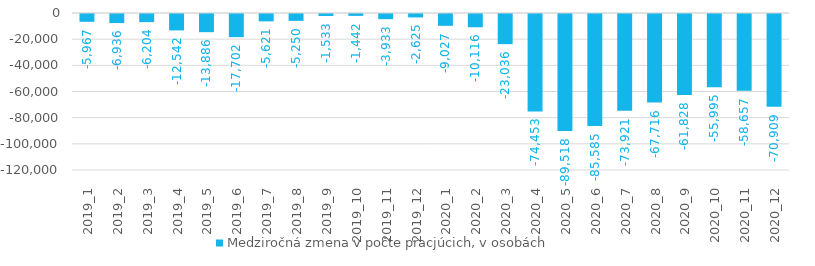
| Category | Medziročná zmena v počte pracjúcich, v osobách |
|---|---|
| 2019_1 | -5967 |
| 2019_2 | -6936 |
| 2019_3 | -6204 |
| 2019_4 | -12542 |
| 2019_5 | -13886 |
| 2019_6 | -17702 |
| 2019_7 | -5621 |
| 2019_8 | -5250 |
| 2019_9 | -1533 |
| 2019_10 | -1442 |
| 2019_11 | -3933 |
| 2019_12 | -2625 |
| 2020_1 | -9027 |
| 2020_2 | -10116 |
| 2020_3 | -23036 |
| 2020_4 | -74453 |
| 2020_5 | -89518 |
| 2020_6 | -85585 |
| 2020_7 | -73921 |
| 2020_8 | -67716 |
| 2020_9 | -61828 |
| 2020_10 | -55995 |
| 2020_11 | -58657 |
| 2020_12 | -70909 |